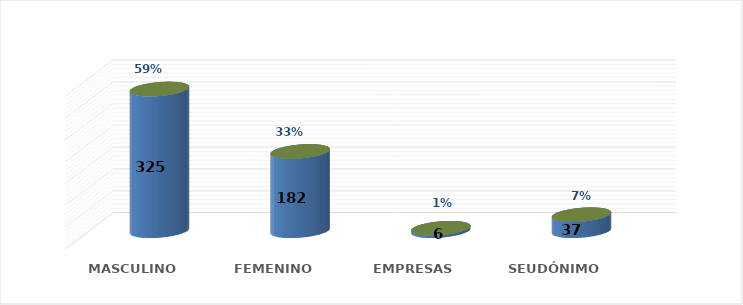
| Category | SOLICITUD POR GÉNERO | Series 1 |
|---|---|---|
| MASCULINO | 325 | 0.591 |
| FEMENINO | 182 | 0.331 |
| EMPRESAS | 6 | 0.011 |
| SEUDÓNIMO | 37 | 0.067 |